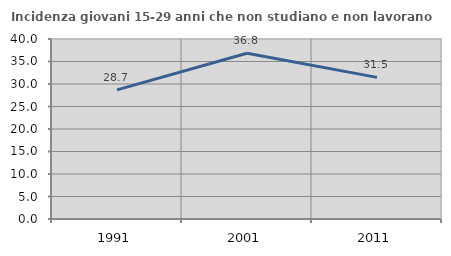
| Category | Incidenza giovani 15-29 anni che non studiano e non lavorano  |
|---|---|
| 1991.0 | 28.696 |
| 2001.0 | 36.821 |
| 2011.0 | 31.467 |